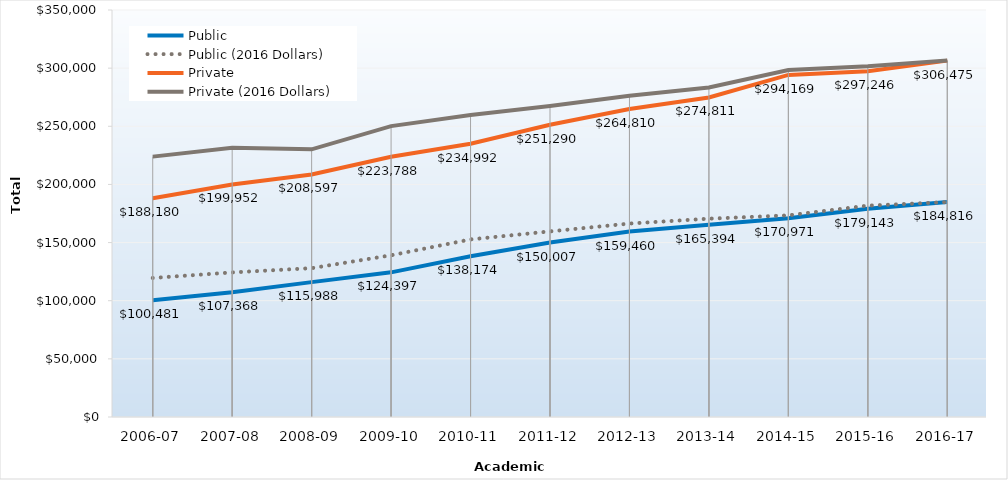
| Category | Public | Public (2016 Dollars) | Private | Private (2016 Dollars) |
|---|---|---|---|---|
| 2006-07 | 100481 | 119561 | 188180 | 223912.87 |
| 2007-08 | 107368 | 124330.38 | 199952 | 231541.14 |
| 2008-09 | 115988 | 127993.27 | 208597 | 230187.7 |
| 2009-10 | 124397 | 139061.25 | 223788 | 250168.72 |
| 2010-11 | 138174 | 152715.74 | 234992 | 259723.07 |
| 2011-12 | 150007 | 159619.42 | 251290 | 267392.61 |
| 2012-13 | 159460 | 166354.36 | 264810 | 276277.51 |
| 2013-14 | 165394 | 170535.61 | 274811 | 283354.06 |
| 2014-15 | 170971 | 173410.97 | 294169 | 298367.16 |
| 2015-16 | 179142.68 | 181765.27 | 297246.04 | 301597.04 |
| 2016-17 | 184815.95 | 184815.95 | 306475.19 | 306475.19 |